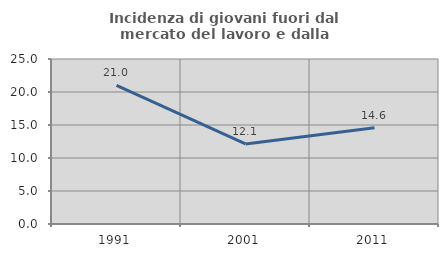
| Category | Incidenza di giovani fuori dal mercato del lavoro e dalla formazione  |
|---|---|
| 1991.0 | 20.994 |
| 2001.0 | 12.135 |
| 2011.0 | 14.599 |